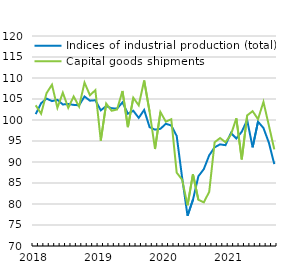
| Category | Indices of industrial production (total) | Capital goods shipments |
|---|---|---|
| 2018.0 | 101.4 | 103.5 |
| nan | 104 | 101.5 |
| nan | 105.1 | 106.4 |
| nan | 104.5 | 108.4 |
| nan | 104.8 | 102.9 |
| nan | 103.7 | 106.5 |
| nan | 103.8 | 102.9 |
| nan | 103.6 | 105.6 |
| nan | 103.5 | 103.2 |
| nan | 105.6 | 108.9 |
| nan | 104.6 | 105.9 |
| nan | 104.7 | 107.1 |
| 2019.0 | 102.3 | 95.1 |
| nan | 103.3 | 103.9 |
| nan | 102.8 | 102.2 |
| nan | 102.7 | 102.5 |
| nan | 104.2 | 106.9 |
| nan | 101.5 | 98.3 |
| nan | 102.2 | 105.3 |
| nan | 100.5 | 103.5 |
| nan | 102.4 | 109.4 |
| nan | 98.3 | 102 |
| nan | 97.7 | 93.1 |
| nan | 97.9 | 101.9 |
| 2020.0 | 99.1 | 99.6 |
| nan | 98.7 | 100.2 |
| nan | 96.2 | 87.5 |
| nan | 86.3 | 85.8 |
| nan | 77.2 | 79.7 |
| nan | 81 | 87.1 |
| nan | 86.6 | 81 |
| nan | 88.3 | 80.4 |
| nan | 91.6 | 82.9 |
| nan | 93.5 | 94.7 |
| nan | 94.2 | 95.7 |
| nan | 94 | 94.7 |
| 2021.0 | 96.9 | 96.5 |
| nan | 95.6 | 100.4 |
| nan | 97.2 | 90.6 |
| nan | 100 | 101.1 |
| nan | 93.5 | 102.1 |
| nan | 99.6 | 100.2 |
| nan | 98.1 | 104.3 |
| nan | 94.6 | 98.7 |
| nan | 89.5 | 93 |